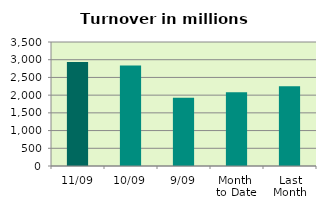
| Category | Series 0 |
|---|---|
| 11/09 | 2935.022 |
| 10/09 | 2834.605 |
| 9/09 | 1929.275 |
| Month 
to Date | 2081.42 |
| Last
Month | 2251.437 |